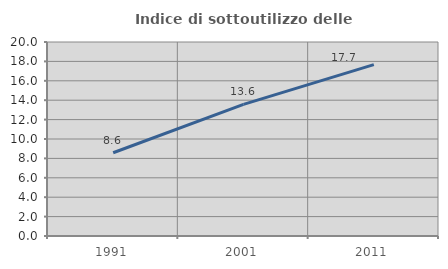
| Category | Indice di sottoutilizzo delle abitazioni  |
|---|---|
| 1991.0 | 8.58 |
| 2001.0 | 13.573 |
| 2011.0 | 17.664 |